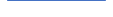
| Category | Series 0 |
|---|---|
| 0 | 0 |
| 1 | 0 |
| 2 | 0 |
| 3 | 0 |
| 4 | 0 |
| 5 | 0 |
| 6 | 4 |
| 7 | 1 |
| 8 | 3 |